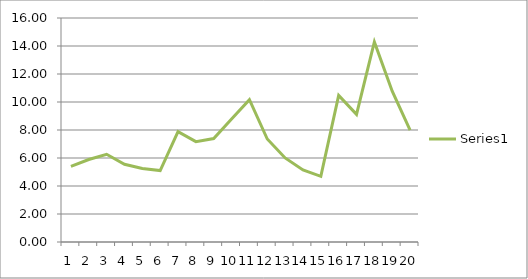
| Category | Series 0 | Series 1 | Series 2 |
|---|---|---|---|
| 0 |  |  | 5.406 |
| 1 |  |  | 5.893 |
| 2 |  |  | 6.268 |
| 3 |  |  | 5.556 |
| 4 |  |  | 5.256 |
| 5 |  |  | 5.106 |
| 6 |  |  | 7.881 |
| 7 |  |  | 7.168 |
| 8 |  |  | 7.393 |
| 9 |  |  | 8.781 |
| 10 |  |  | 10.168 |
| 11 |  |  | 7.356 |
| 12 |  |  | 6.006 |
| 13 |  |  | 5.143 |
| 14 |  |  | 4.693 |
| 15 |  |  | 10.468 |
| 16 |  |  | 9.118 |
| 17 |  |  | 14.287 |
| 18 |  |  | 10.774 |
| 19 |  |  | 7.994 |